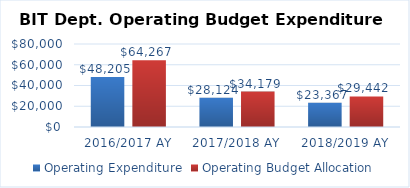
| Category | Operating Expenditure | Operating Budget Allocation |
|---|---|---|
| 2016/2017 AY | 48205.17 | 64267.11 |
| 2017/2018 AY | 28123.94 | 34178.59 |
| 2018/2019 AY | 23366.68 | 29441.55 |